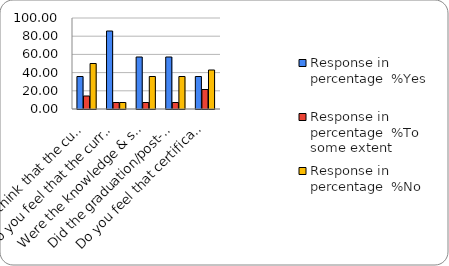
| Category | Response in percentage  |
|---|---|
| Do you think that the curriculum which you had during your graduation/post graduation has provided you with the knowledge & skills necessary to get employed/Self-employed or start own business? | 50 |
| Do you feel that the curriculum you studied is helpful in progression to higher studies? | 7.143 |
| Were the knowledge & skills acquired through the curriculum useful to you while working on the job?   | 35.714 |
| Did the graduation/post-graduation programme bring about any attitudinal and behavioural change in you? | 35.714 |
| Do you feel that certificate/ diploma courses offered by the college in addition to the curriculum lead to better career prospects? | 42.857 |